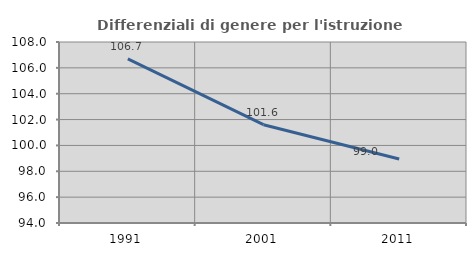
| Category | Differenziali di genere per l'istruzione superiore |
|---|---|
| 1991.0 | 106.698 |
| 2001.0 | 101.603 |
| 2011.0 | 98.954 |